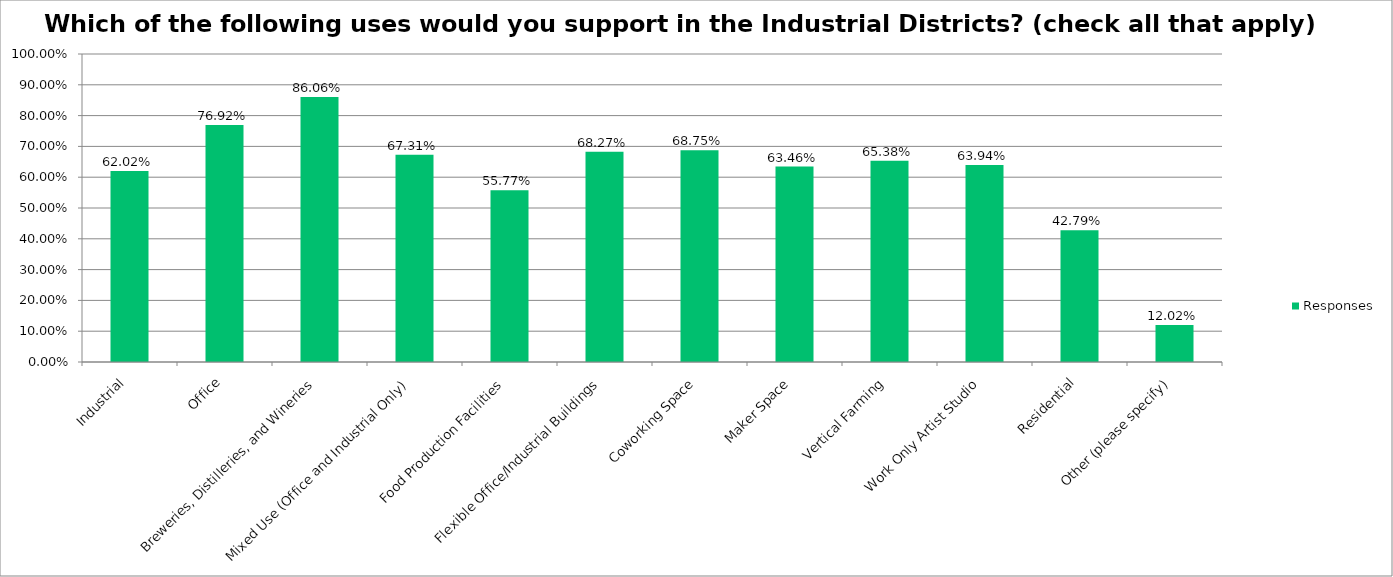
| Category | Responses |
|---|---|
| Industrial | 0.62 |
| Office | 0.769 |
| Breweries, Distilleries, and Wineries | 0.861 |
| Mixed Use (Office and Industrial Only) | 0.673 |
| Food Production Facilities | 0.558 |
| Flexible Office/Industrial Buildings | 0.683 |
| Coworking Space | 0.688 |
| Maker Space | 0.635 |
| Vertical Farming | 0.654 |
| Work Only Artist Studio | 0.639 |
| Residential | 0.428 |
| Other (please specify) | 0.12 |